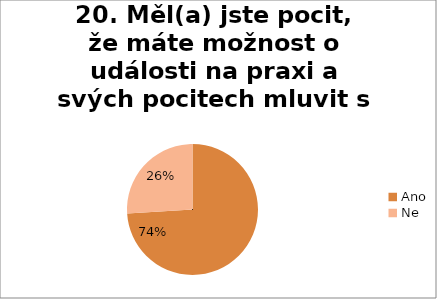
| Category | 20. Měl(a) jste pocit, že máte možnost o události na praxi a svých pocitech mluvit s vyučujícím(i)?  |
|---|---|
| Ano | 0.74 |
| Ne | 0.26 |